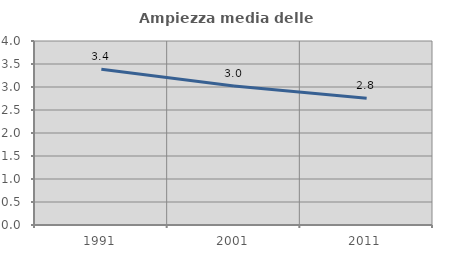
| Category | Ampiezza media delle famiglie |
|---|---|
| 1991.0 | 3.387 |
| 2001.0 | 3.02 |
| 2011.0 | 2.756 |